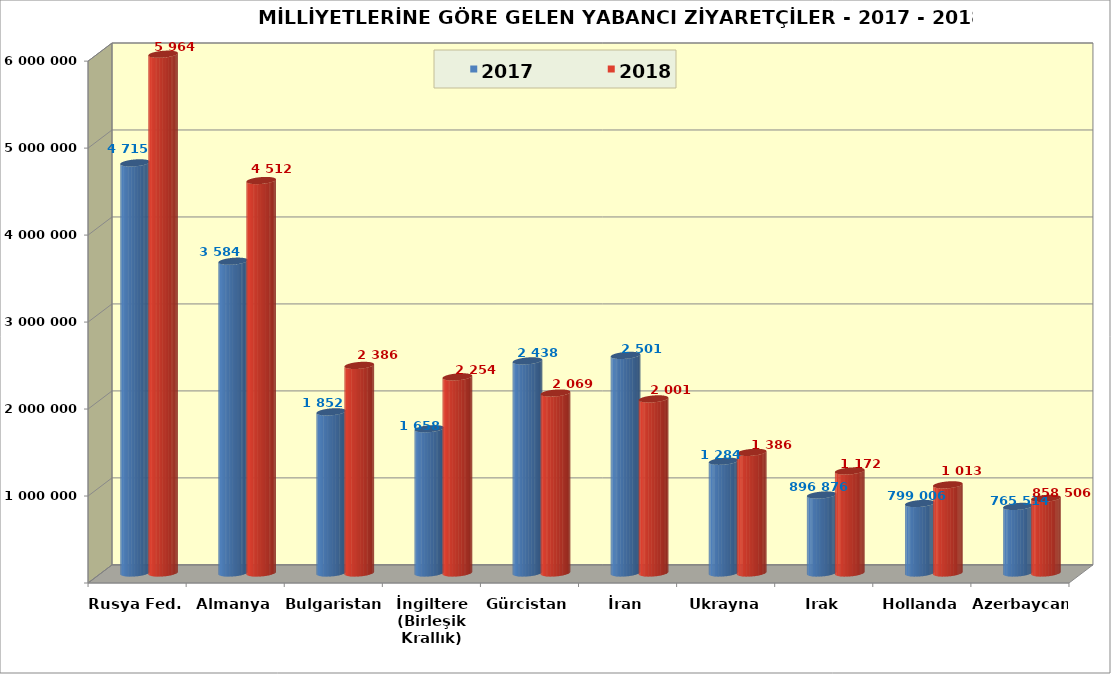
| Category | 2017 | 2018 |
|---|---|---|
| Rusya Fed. | 4715438 | 5964613 |
| Almanya | 3584653 | 4512360 |
| Bulgaristan | 1852867 | 2386885 |
| İngiltere (Birleşik Krallık) | 1658715 | 2254871 |
| Gürcistan | 2438730 | 2069392 |
| İran | 2501948 | 2001744 |
| Ukrayna | 1284735 | 1386934 |
| Irak | 896876 | 1172896 |
| Hollanda | 799006 | 1013642 |
| Azerbaycan | 765514 | 858506 |